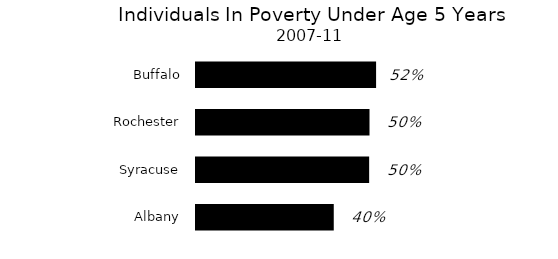
| Category | Series 0 |
|---|---|
| Albany | 0.397 |
| Syracuse | 0.499 |
| Rochester | 0.5 |
| Buffalo | 0.519 |